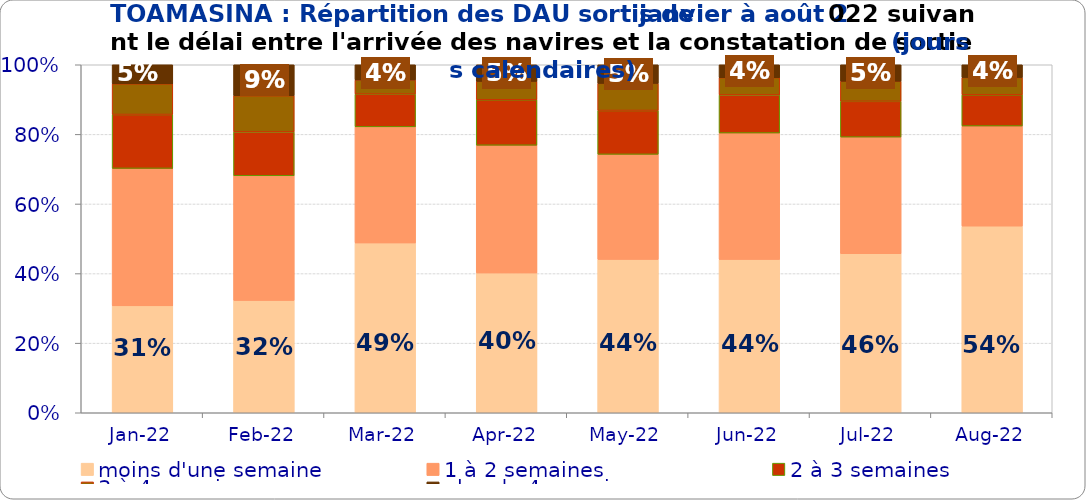
| Category | moins d'une semaine | 1 à 2 semaines | 2 à 3 semaines | 3 à 4 semaines | plus de 4 semaines |
|---|---|---|---|---|---|
| 2022-01-01 | 0.307 | 0.395 | 0.155 | 0.088 | 0.055 |
| 2022-02-01 | 0.323 | 0.358 | 0.126 | 0.104 | 0.089 |
| 2022-03-01 | 0.488 | 0.334 | 0.094 | 0.041 | 0.044 |
| 2022-04-01 | 0.402 | 0.367 | 0.131 | 0.053 | 0.048 |
| 2022-05-01 | 0.441 | 0.302 | 0.126 | 0.078 | 0.054 |
| 2022-06-01 | 0.441 | 0.363 | 0.109 | 0.05 | 0.037 |
| 2022-07-01 | 0.457 | 0.335 | 0.103 | 0.058 | 0.047 |
| 2022-08-01 | 0.536 | 0.288 | 0.09 | 0.05 | 0.037 |